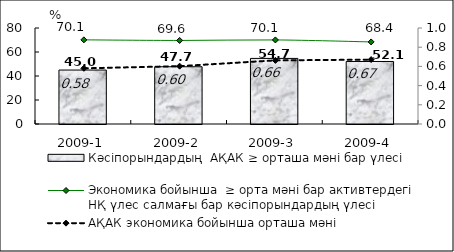
| Category | Кәсіпорындардың  АҚАК ≥ орташа мәні бар үлесі  |
|---|---|
| 2009-1 | 44.97 |
| 2009-2 | 47.71 |
| 2009-3 | 54.66 |
| 2009-4 | 52.1 |